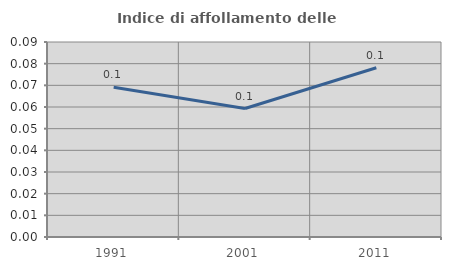
| Category | Indice di affollamento delle abitazioni  |
|---|---|
| 1991.0 | 0.069 |
| 2001.0 | 0.059 |
| 2011.0 | 0.078 |